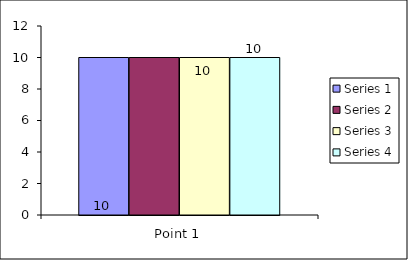
| Category | Series 1 | Series 2 | Series 3 | Series 4 |
|---|---|---|---|---|
| Point 1 | 10 | 10 | 10 | 10 |